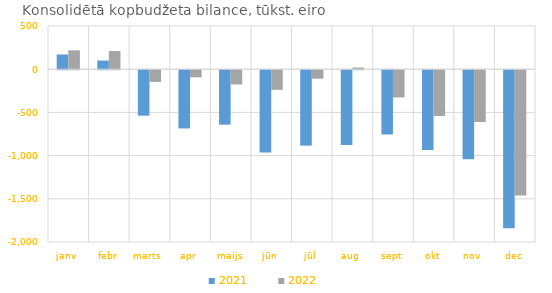
| Category | 2021 | 2022 |
|---|---|---|
| janv | 170157.398 | 218389.091 |
| febr | 100119.496 | 210185.141 |
| marts | -526188.27 | -135684.596 |
| apr | -673998.575 | -82545.759 |
| maijs | -630296.539 | -165099.527 |
| jūn | -953547.976 | -227076.221 |
| jūl | -872897.27 | -98216.206 |
| aug | -864679.341 | 19124.955 |
| sept | -744219.279 | -315094.554 |
| okt | -924686.722 | -529965.02 |
| nov | -1031801.177 | -599385.297 |
| dec | -1828320.005 | -1450688.242 |